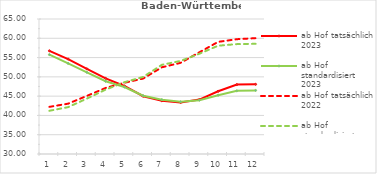
| Category | ab Hof tatsächlich 2023 | ab Hof standardisiert 2023 | ab Hof tatsächlich 2022 | ab Hof standardisiert 2022 |
|---|---|---|---|---|
| 0 | 56.75 | 55.759 | 42.22 | 41.207 |
| 1 | 54.607 | 53.482 | 43.047 | 42.148 |
| 2 | 52.076 | 51.176 | 45.063 | 44.366 |
| 3 | 49.611 | 48.863 | 47.126 | 46.685 |
| 4 | 47.632 | 47.365 | 48.462 | 48.608 |
| 5 | 44.985 | 45.107 | 49.556 | 49.977 |
| 6 | 43.802 | 44.092 | 52.486 | 53.116 |
| 7 | 43.371 | 43.526 | 53.634 | 54.141 |
| 8 | 44.106 | 43.955 | 56.371 | 55.995 |
| 9 | 46.257 | 45.252 | 59.072 | 58.074 |
| 10 | 47.994 | 46.368 | 59.765 | 58.488 |
| 11 | 48.066 | 46.485 | 60.03 | 58.566 |